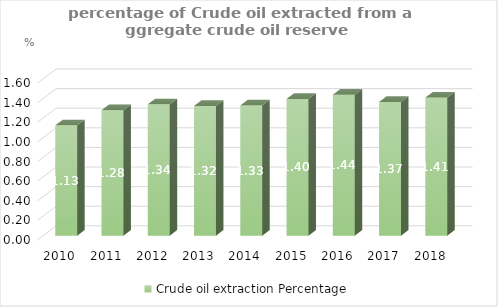
| Category | Crude oil extraction Percentage |
|---|---|
| 2010.0 | 1.127 |
| 2011.0 | 1.28 |
| 2012.0 | 1.34 |
| 2013.0 | 1.323 |
| 2014.0 | 1.33 |
| 2015.0 | 1.396 |
| 2016.0 | 1.438 |
| 2017.0 | 1.365 |
| 2018.0 | 1.41 |